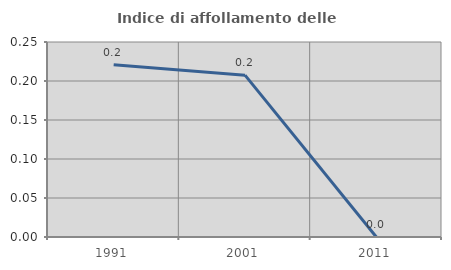
| Category | Indice di affollamento delle abitazioni  |
|---|---|
| 1991.0 | 0.221 |
| 2001.0 | 0.207 |
| 2011.0 | 0 |